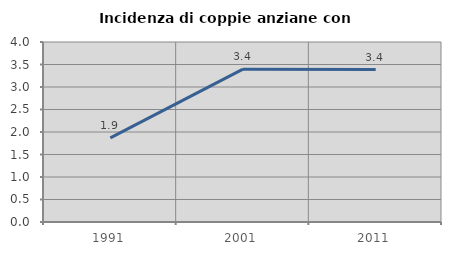
| Category | Incidenza di coppie anziane con figli |
|---|---|
| 1991.0 | 1.869 |
| 2001.0 | 3.397 |
| 2011.0 | 3.388 |